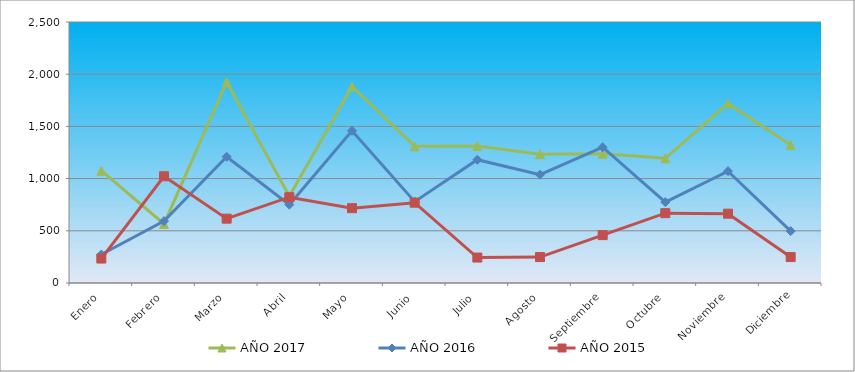
| Category | AÑO 2017 | AÑO 2016 | AÑO 2015 |
|---|---|---|---|
| Enero | 1075.706 | 272.501 | 234.117 |
| Febrero | 565.537 | 592.808 | 1022.471 |
| Marzo | 1925.989 | 1209.52 | 616.349 |
| Abril | 830.508 | 750.572 | 821.799 |
| Mayo | 1882.486 | 1458.117 | 716.685 |
| Junio | 1309.04 | 779.256 | 769.242 |
| Julio | 1312.994 | 1180.836 | 243.673 |
| Agosto | 1233.898 | 1037.414 | 248.451 |
| Septiembre | 1237.853 | 1300.354 | 458.679 |
| Octubre | 1194.35 | 774.475 | 668.906 |
| Noviembre | 1720.339 | 1070.879 | 664.129 |
| Diciembre | 1320.904 | 497.194 | 248.451 |